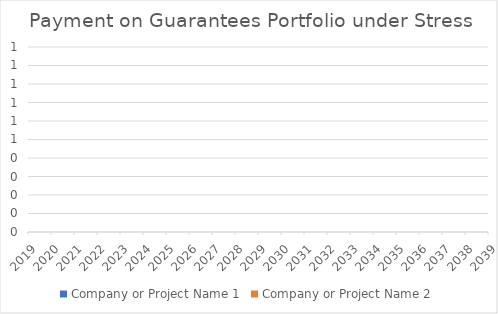
| Category | Company or Project Name 1 | Company or Project Name 2 |
|---|---|---|
| 2019.0 | 0 | 0 |
| 2020.0 | 0 | 0 |
| 2021.0 | 0 | 0 |
| 2022.0 | 0 | 0 |
| 2023.0 | 0 | 0 |
| 2024.0 | 0 | 0 |
| 2025.0 | 0 | 0 |
| 2026.0 | 0 | 0 |
| 2027.0 | 0 | 0 |
| 2028.0 | 0 | 0 |
| 2029.0 | 0 | 0 |
| 2030.0 | 0 | 0 |
| 2031.0 | 0 | 0 |
| 2032.0 | 0 | 0 |
| 2033.0 | 0 | 0 |
| 2034.0 | 0 | 0 |
| 2035.0 | 0 | 0 |
| 2036.0 | 0 | 0 |
| 2037.0 | 0 | 0 |
| 2038.0 | 0 | 0 |
| 2039.0 | 0 | 0 |